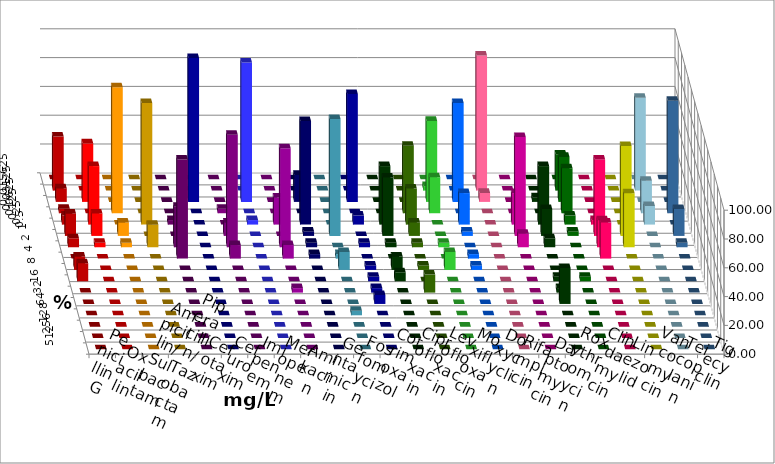
| Category | Penicillin G | Oxacillin | Ampicillin/ Sulbactam | Piperacillin/ Tazobactam | Cefotaxim | Cefuroxim | Imipenem | Meropenem | Amikacin | Gentamicin | Fosfomycin | Cotrimoxazol | Ciprofloxacin | Levofloxacin | Moxifloxacin | Doxycyclin | Rifampicin | Daptomycin | Roxythromycin | Clindamycin | Linezolid | Vancomycin | Teicoplanin | Tigecyclin |
|---|---|---|---|---|---|---|---|---|---|---|---|---|---|---|---|---|---|---|---|---|---|---|---|---|
| 0.015625 | 0 | 0 | 0 | 0 | 0 | 0 | 0 | 0 | 0 | 0 | 0 | 0 | 0 | 0 | 0 | 0 | 0 | 0 | 0 | 0 | 0 | 0 | 0 | 0 |
| 0.03125 | 37.5 | 0 | 0 | 0 | 0 | 0 | 0 | 0 | 0 | 0 | 0 | 0 | 0 | 0 | 3.125 | 0 | 93.75 | 0 | 0 | 25 | 0 | 0 | 0 | 64.516 |
| 0.0625 | 9.375 | 40.625 | 0 | 0 | 0 | 0 | 100 | 96.875 | 0 | 18.75 | 0 | 75 | 0 | 0 | 56.25 | 68.75 | 6.25 | 0 | 3.125 | 31.25 | 0 | 0 | 0 | 0 |
| 0.125 | 3.125 | 0 | 87.5 | 0 | 0 | 3.125 | 0 | 0 | 0 | 0 | 0 | 0 | 0 | 46.875 | 25 | 0 | 0 | 0 | 0 | 31.25 | 0 | 0 | 78.125 | 22.581 |
| 0.25 | 6.25 | 40.625 | 0 | 84.375 | 3.125 | 0 | 0 | 3.125 | 18.75 | 71.875 | 0 | 6.25 | 40.625 | 25 | 0 | 21.875 | 0 | 21.875 | 40.625 | 6.25 | 3.125 | 0 | 0 | 12.903 |
| 0.5 | 15.625 | 15.625 | 9.375 | 0 | 0 | 9.375 | 0 | 0 | 0 | 3.125 | 81.25 | 0 | 40.625 | 9.375 | 0 | 3.125 | 0 | 68.75 | 18.75 | 3.125 | 53.125 | 62.5 | 18.75 | 0 |
| 1.0 | 6.25 | 3.125 | 3.125 | 15.625 | 28.125 | 78.125 | 0 | 0 | 68.75 | 3.125 | 0 | 3.125 | 3.125 | 3.125 | 3.125 | 0 | 0 | 9.375 | 6.25 | 0 | 18.75 | 37.5 | 3.125 | 0 |
| 2.0 | 0 | 0 | 0 | 0 | 68.75 | 9.375 | 0 | 0 | 9.375 | 3.125 | 3.125 | 0 | 0 | 0 | 0 | 3.125 | 0 | 0 | 0 | 0 | 25 | 0 | 0 | 0 |
| 4.0 | 9.375 | 0 | 0 | 0 | 0 | 0 | 0 | 0 | 0 | 0 | 12.5 | 3.125 | 9.375 | 3.125 | 12.5 | 3.125 | 0 | 0 | 0 | 0 | 0 | 0 | 0 | 0 |
| 8.0 | 12.5 | 0 | 0 | 0 | 0 | 0 | 0 | 0 | 0 | 0 | 0 | 3.125 | 6.25 | 0 | 0 | 0 | 0 | 0 | 3.125 | 3.125 | 0 | 0 | 0 | 0 |
| 16.0 | 0 | 0 | 0 | 0 | 0 | 0 | 0 | 0 | 3.125 | 0 | 0 | 3.125 | 0 | 12.5 | 0 | 0 | 0 | 0 | 3.125 | 0 | 0 | 0 | 0 | 0 |
| 32.0 | 0 | 0 | 0 | 0 | 0 | 0 | 0 | 0 | 0 | 0 | 0 | 6.25 | 0 | 0 | 0 | 0 | 0 | 0 | 25 | 0 | 0 | 0 | 0 | 0 |
| 64.0 | 0 | 0 | 0 | 0 | 0 | 0 | 0 | 0 | 0 | 0 | 3.125 | 0 | 0 | 0 | 0 | 0 | 0 | 0 | 0 | 0 | 0 | 0 | 0 | 0 |
| 128.0 | 0 | 0 | 0 | 0 | 0 | 0 | 0 | 0 | 0 | 0 | 0 | 0 | 0 | 0 | 0 | 0 | 0 | 0 | 0 | 0 | 0 | 0 | 0 | 0 |
| 256.0 | 0 | 0 | 0 | 0 | 0 | 0 | 0 | 0 | 0 | 0 | 0 | 0 | 0 | 0 | 0 | 0 | 0 | 0 | 0 | 0 | 0 | 0 | 0 | 0 |
| 512.0 | 0 | 0 | 0 | 0 | 0 | 0 | 0 | 0 | 0 | 0 | 0 | 0 | 0 | 0 | 0 | 0 | 0 | 0 | 0 | 0 | 0 | 0 | 0 | 0 |